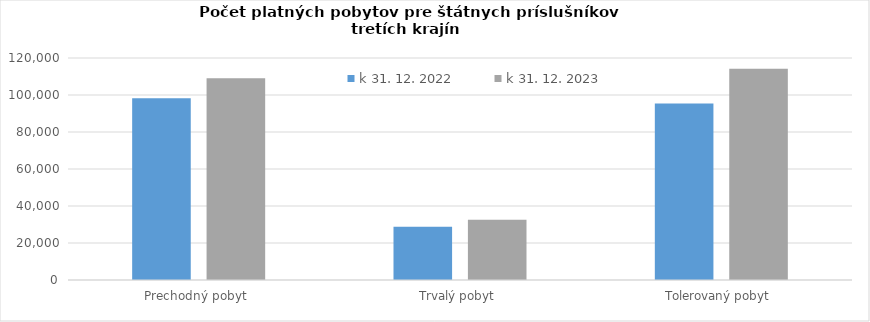
| Category | k 31. 12. 2022 | k 31. 12. 2023 |
|---|---|---|
| Prechodný pobyt  | 98281 | 109043 |
| Trvalý pobyt  | 28794 | 32632 |
| Tolerovaný pobyt  | 95450 | 114223 |